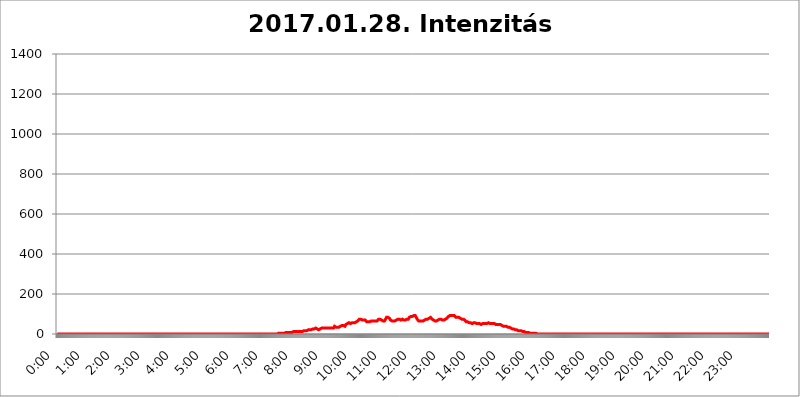
| Category | 2017.01.28. Intenzitás [W/m^2] |
|---|---|
| 0.0 | 0 |
| 0.0006944444444444445 | 0 |
| 0.001388888888888889 | 0 |
| 0.0020833333333333333 | 0 |
| 0.002777777777777778 | 0 |
| 0.003472222222222222 | 0 |
| 0.004166666666666667 | 0 |
| 0.004861111111111111 | 0 |
| 0.005555555555555556 | 0 |
| 0.0062499999999999995 | 0 |
| 0.006944444444444444 | 0 |
| 0.007638888888888889 | 0 |
| 0.008333333333333333 | 0 |
| 0.009027777777777779 | 0 |
| 0.009722222222222222 | 0 |
| 0.010416666666666666 | 0 |
| 0.011111111111111112 | 0 |
| 0.011805555555555555 | 0 |
| 0.012499999999999999 | 0 |
| 0.013194444444444444 | 0 |
| 0.013888888888888888 | 0 |
| 0.014583333333333332 | 0 |
| 0.015277777777777777 | 0 |
| 0.015972222222222224 | 0 |
| 0.016666666666666666 | 0 |
| 0.017361111111111112 | 0 |
| 0.018055555555555557 | 0 |
| 0.01875 | 0 |
| 0.019444444444444445 | 0 |
| 0.02013888888888889 | 0 |
| 0.020833333333333332 | 0 |
| 0.02152777777777778 | 0 |
| 0.022222222222222223 | 0 |
| 0.02291666666666667 | 0 |
| 0.02361111111111111 | 0 |
| 0.024305555555555556 | 0 |
| 0.024999999999999998 | 0 |
| 0.025694444444444447 | 0 |
| 0.02638888888888889 | 0 |
| 0.027083333333333334 | 0 |
| 0.027777777777777776 | 0 |
| 0.02847222222222222 | 0 |
| 0.029166666666666664 | 0 |
| 0.029861111111111113 | 0 |
| 0.030555555555555555 | 0 |
| 0.03125 | 0 |
| 0.03194444444444445 | 0 |
| 0.03263888888888889 | 0 |
| 0.03333333333333333 | 0 |
| 0.034027777777777775 | 0 |
| 0.034722222222222224 | 0 |
| 0.035416666666666666 | 0 |
| 0.036111111111111115 | 0 |
| 0.03680555555555556 | 0 |
| 0.0375 | 0 |
| 0.03819444444444444 | 0 |
| 0.03888888888888889 | 0 |
| 0.03958333333333333 | 0 |
| 0.04027777777777778 | 0 |
| 0.04097222222222222 | 0 |
| 0.041666666666666664 | 0 |
| 0.042361111111111106 | 0 |
| 0.04305555555555556 | 0 |
| 0.043750000000000004 | 0 |
| 0.044444444444444446 | 0 |
| 0.04513888888888889 | 0 |
| 0.04583333333333334 | 0 |
| 0.04652777777777778 | 0 |
| 0.04722222222222222 | 0 |
| 0.04791666666666666 | 0 |
| 0.04861111111111111 | 0 |
| 0.049305555555555554 | 0 |
| 0.049999999999999996 | 0 |
| 0.05069444444444445 | 0 |
| 0.051388888888888894 | 0 |
| 0.052083333333333336 | 0 |
| 0.05277777777777778 | 0 |
| 0.05347222222222222 | 0 |
| 0.05416666666666667 | 0 |
| 0.05486111111111111 | 0 |
| 0.05555555555555555 | 0 |
| 0.05625 | 0 |
| 0.05694444444444444 | 0 |
| 0.057638888888888885 | 0 |
| 0.05833333333333333 | 0 |
| 0.05902777777777778 | 0 |
| 0.059722222222222225 | 0 |
| 0.06041666666666667 | 0 |
| 0.061111111111111116 | 0 |
| 0.06180555555555556 | 0 |
| 0.0625 | 0 |
| 0.06319444444444444 | 0 |
| 0.06388888888888888 | 0 |
| 0.06458333333333334 | 0 |
| 0.06527777777777778 | 0 |
| 0.06597222222222222 | 0 |
| 0.06666666666666667 | 0 |
| 0.06736111111111111 | 0 |
| 0.06805555555555555 | 0 |
| 0.06874999999999999 | 0 |
| 0.06944444444444443 | 0 |
| 0.07013888888888889 | 0 |
| 0.07083333333333333 | 0 |
| 0.07152777777777779 | 0 |
| 0.07222222222222223 | 0 |
| 0.07291666666666667 | 0 |
| 0.07361111111111111 | 0 |
| 0.07430555555555556 | 0 |
| 0.075 | 0 |
| 0.07569444444444444 | 0 |
| 0.0763888888888889 | 0 |
| 0.07708333333333334 | 0 |
| 0.07777777777777778 | 0 |
| 0.07847222222222222 | 0 |
| 0.07916666666666666 | 0 |
| 0.0798611111111111 | 0 |
| 0.08055555555555556 | 0 |
| 0.08125 | 0 |
| 0.08194444444444444 | 0 |
| 0.08263888888888889 | 0 |
| 0.08333333333333333 | 0 |
| 0.08402777777777777 | 0 |
| 0.08472222222222221 | 0 |
| 0.08541666666666665 | 0 |
| 0.08611111111111112 | 0 |
| 0.08680555555555557 | 0 |
| 0.08750000000000001 | 0 |
| 0.08819444444444445 | 0 |
| 0.08888888888888889 | 0 |
| 0.08958333333333333 | 0 |
| 0.09027777777777778 | 0 |
| 0.09097222222222222 | 0 |
| 0.09166666666666667 | 0 |
| 0.09236111111111112 | 0 |
| 0.09305555555555556 | 0 |
| 0.09375 | 0 |
| 0.09444444444444444 | 0 |
| 0.09513888888888888 | 0 |
| 0.09583333333333333 | 0 |
| 0.09652777777777777 | 0 |
| 0.09722222222222222 | 0 |
| 0.09791666666666667 | 0 |
| 0.09861111111111111 | 0 |
| 0.09930555555555555 | 0 |
| 0.09999999999999999 | 0 |
| 0.10069444444444443 | 0 |
| 0.1013888888888889 | 0 |
| 0.10208333333333335 | 0 |
| 0.10277777777777779 | 0 |
| 0.10347222222222223 | 0 |
| 0.10416666666666667 | 0 |
| 0.10486111111111111 | 0 |
| 0.10555555555555556 | 0 |
| 0.10625 | 0 |
| 0.10694444444444444 | 0 |
| 0.1076388888888889 | 0 |
| 0.10833333333333334 | 0 |
| 0.10902777777777778 | 0 |
| 0.10972222222222222 | 0 |
| 0.1111111111111111 | 0 |
| 0.11180555555555556 | 0 |
| 0.11180555555555556 | 0 |
| 0.1125 | 0 |
| 0.11319444444444444 | 0 |
| 0.11388888888888889 | 0 |
| 0.11458333333333333 | 0 |
| 0.11527777777777777 | 0 |
| 0.11597222222222221 | 0 |
| 0.11666666666666665 | 0 |
| 0.1173611111111111 | 0 |
| 0.11805555555555557 | 0 |
| 0.11944444444444445 | 0 |
| 0.12013888888888889 | 0 |
| 0.12083333333333333 | 0 |
| 0.12152777777777778 | 0 |
| 0.12222222222222223 | 0 |
| 0.12291666666666667 | 0 |
| 0.12291666666666667 | 0 |
| 0.12361111111111112 | 0 |
| 0.12430555555555556 | 0 |
| 0.125 | 0 |
| 0.12569444444444444 | 0 |
| 0.12638888888888888 | 0 |
| 0.12708333333333333 | 0 |
| 0.16875 | 0 |
| 0.12847222222222224 | 0 |
| 0.12916666666666668 | 0 |
| 0.12986111111111112 | 0 |
| 0.13055555555555556 | 0 |
| 0.13125 | 0 |
| 0.13194444444444445 | 0 |
| 0.1326388888888889 | 0 |
| 0.13333333333333333 | 0 |
| 0.13402777777777777 | 0 |
| 0.13402777777777777 | 0 |
| 0.13472222222222222 | 0 |
| 0.13541666666666666 | 0 |
| 0.1361111111111111 | 0 |
| 0.13749999999999998 | 0 |
| 0.13819444444444443 | 0 |
| 0.1388888888888889 | 0 |
| 0.13958333333333334 | 0 |
| 0.14027777777777778 | 0 |
| 0.14097222222222222 | 0 |
| 0.14166666666666666 | 0 |
| 0.1423611111111111 | 0 |
| 0.14305555555555557 | 0 |
| 0.14375000000000002 | 0 |
| 0.14444444444444446 | 0 |
| 0.1451388888888889 | 0 |
| 0.1451388888888889 | 0 |
| 0.14652777777777778 | 0 |
| 0.14722222222222223 | 0 |
| 0.14791666666666667 | 0 |
| 0.1486111111111111 | 0 |
| 0.14930555555555555 | 0 |
| 0.15 | 0 |
| 0.15069444444444444 | 0 |
| 0.15138888888888888 | 0 |
| 0.15208333333333332 | 0 |
| 0.15277777777777776 | 0 |
| 0.15347222222222223 | 0 |
| 0.15416666666666667 | 0 |
| 0.15486111111111112 | 0 |
| 0.15555555555555556 | 0 |
| 0.15625 | 0 |
| 0.15694444444444444 | 0 |
| 0.15763888888888888 | 0 |
| 0.15833333333333333 | 0 |
| 0.15902777777777777 | 0 |
| 0.15972222222222224 | 0 |
| 0.16041666666666668 | 0 |
| 0.16111111111111112 | 0 |
| 0.16180555555555556 | 0 |
| 0.1625 | 0 |
| 0.16319444444444445 | 0 |
| 0.1638888888888889 | 0 |
| 0.16458333333333333 | 0 |
| 0.16527777777777777 | 0 |
| 0.16597222222222222 | 0 |
| 0.16666666666666666 | 0 |
| 0.1673611111111111 | 0 |
| 0.16805555555555554 | 0 |
| 0.16874999999999998 | 0 |
| 0.16944444444444443 | 0 |
| 0.17013888888888887 | 0 |
| 0.1708333333333333 | 0 |
| 0.17152777777777775 | 0 |
| 0.17222222222222225 | 0 |
| 0.1729166666666667 | 0 |
| 0.17361111111111113 | 0 |
| 0.17430555555555557 | 0 |
| 0.17500000000000002 | 0 |
| 0.17569444444444446 | 0 |
| 0.1763888888888889 | 0 |
| 0.17708333333333334 | 0 |
| 0.17777777777777778 | 0 |
| 0.17847222222222223 | 0 |
| 0.17916666666666667 | 0 |
| 0.1798611111111111 | 0 |
| 0.18055555555555555 | 0 |
| 0.18125 | 0 |
| 0.18194444444444444 | 0 |
| 0.1826388888888889 | 0 |
| 0.18333333333333335 | 0 |
| 0.1840277777777778 | 0 |
| 0.18472222222222223 | 0 |
| 0.18541666666666667 | 0 |
| 0.18611111111111112 | 0 |
| 0.18680555555555556 | 0 |
| 0.1875 | 0 |
| 0.18819444444444444 | 0 |
| 0.18888888888888888 | 0 |
| 0.18958333333333333 | 0 |
| 0.19027777777777777 | 0 |
| 0.1909722222222222 | 0 |
| 0.19166666666666665 | 0 |
| 0.19236111111111112 | 0 |
| 0.19305555555555554 | 0 |
| 0.19375 | 0 |
| 0.19444444444444445 | 0 |
| 0.1951388888888889 | 0 |
| 0.19583333333333333 | 0 |
| 0.19652777777777777 | 0 |
| 0.19722222222222222 | 0 |
| 0.19791666666666666 | 0 |
| 0.1986111111111111 | 0 |
| 0.19930555555555554 | 0 |
| 0.19999999999999998 | 0 |
| 0.20069444444444443 | 0 |
| 0.20138888888888887 | 0 |
| 0.2020833333333333 | 0 |
| 0.2027777777777778 | 0 |
| 0.2034722222222222 | 0 |
| 0.2041666666666667 | 0 |
| 0.20486111111111113 | 0 |
| 0.20555555555555557 | 0 |
| 0.20625000000000002 | 0 |
| 0.20694444444444446 | 0 |
| 0.2076388888888889 | 0 |
| 0.20833333333333334 | 0 |
| 0.20902777777777778 | 0 |
| 0.20972222222222223 | 0 |
| 0.21041666666666667 | 0 |
| 0.2111111111111111 | 0 |
| 0.21180555555555555 | 0 |
| 0.2125 | 0 |
| 0.21319444444444444 | 0 |
| 0.2138888888888889 | 0 |
| 0.21458333333333335 | 0 |
| 0.2152777777777778 | 0 |
| 0.21597222222222223 | 0 |
| 0.21666666666666667 | 0 |
| 0.21736111111111112 | 0 |
| 0.21805555555555556 | 0 |
| 0.21875 | 0 |
| 0.21944444444444444 | 0 |
| 0.22013888888888888 | 0 |
| 0.22083333333333333 | 0 |
| 0.22152777777777777 | 0 |
| 0.2222222222222222 | 0 |
| 0.22291666666666665 | 0 |
| 0.2236111111111111 | 0 |
| 0.22430555555555556 | 0 |
| 0.225 | 0 |
| 0.22569444444444445 | 0 |
| 0.2263888888888889 | 0 |
| 0.22708333333333333 | 0 |
| 0.22777777777777777 | 0 |
| 0.22847222222222222 | 0 |
| 0.22916666666666666 | 0 |
| 0.2298611111111111 | 0 |
| 0.23055555555555554 | 0 |
| 0.23124999999999998 | 0 |
| 0.23194444444444443 | 0 |
| 0.23263888888888887 | 0 |
| 0.2333333333333333 | 0 |
| 0.2340277777777778 | 0 |
| 0.2347222222222222 | 0 |
| 0.2354166666666667 | 0 |
| 0.23611111111111113 | 0 |
| 0.23680555555555557 | 0 |
| 0.23750000000000002 | 0 |
| 0.23819444444444446 | 0 |
| 0.2388888888888889 | 0 |
| 0.23958333333333334 | 0 |
| 0.24027777777777778 | 0 |
| 0.24097222222222223 | 0 |
| 0.24166666666666667 | 0 |
| 0.2423611111111111 | 0 |
| 0.24305555555555555 | 0 |
| 0.24375 | 0 |
| 0.24444444444444446 | 0 |
| 0.24513888888888888 | 0 |
| 0.24583333333333335 | 0 |
| 0.2465277777777778 | 0 |
| 0.24722222222222223 | 0 |
| 0.24791666666666667 | 0 |
| 0.24861111111111112 | 0 |
| 0.24930555555555556 | 0 |
| 0.25 | 0 |
| 0.25069444444444444 | 0 |
| 0.2513888888888889 | 0 |
| 0.2520833333333333 | 0 |
| 0.25277777777777777 | 0 |
| 0.2534722222222222 | 0 |
| 0.25416666666666665 | 0 |
| 0.2548611111111111 | 0 |
| 0.2555555555555556 | 0 |
| 0.25625000000000003 | 0 |
| 0.2569444444444445 | 0 |
| 0.2576388888888889 | 0 |
| 0.25833333333333336 | 0 |
| 0.2590277777777778 | 0 |
| 0.25972222222222224 | 0 |
| 0.2604166666666667 | 0 |
| 0.2611111111111111 | 0 |
| 0.26180555555555557 | 0 |
| 0.2625 | 0 |
| 0.26319444444444445 | 0 |
| 0.2638888888888889 | 0 |
| 0.26458333333333334 | 0 |
| 0.2652777777777778 | 0 |
| 0.2659722222222222 | 0 |
| 0.26666666666666666 | 0 |
| 0.2673611111111111 | 0 |
| 0.26805555555555555 | 0 |
| 0.26875 | 0 |
| 0.26944444444444443 | 0 |
| 0.2701388888888889 | 0 |
| 0.2708333333333333 | 0 |
| 0.27152777777777776 | 0 |
| 0.2722222222222222 | 0 |
| 0.27291666666666664 | 0 |
| 0.2736111111111111 | 0 |
| 0.2743055555555555 | 0 |
| 0.27499999999999997 | 0 |
| 0.27569444444444446 | 0 |
| 0.27638888888888885 | 0 |
| 0.27708333333333335 | 0 |
| 0.2777777777777778 | 0 |
| 0.27847222222222223 | 0 |
| 0.2791666666666667 | 0 |
| 0.2798611111111111 | 0 |
| 0.28055555555555556 | 0 |
| 0.28125 | 0 |
| 0.28194444444444444 | 0 |
| 0.2826388888888889 | 0 |
| 0.2833333333333333 | 0 |
| 0.28402777777777777 | 0 |
| 0.2847222222222222 | 0 |
| 0.28541666666666665 | 0 |
| 0.28611111111111115 | 0 |
| 0.28680555555555554 | 0 |
| 0.28750000000000003 | 0 |
| 0.2881944444444445 | 0 |
| 0.2888888888888889 | 0 |
| 0.28958333333333336 | 0 |
| 0.2902777777777778 | 0 |
| 0.29097222222222224 | 0 |
| 0.2916666666666667 | 0 |
| 0.2923611111111111 | 0 |
| 0.29305555555555557 | 0 |
| 0.29375 | 0 |
| 0.29444444444444445 | 0 |
| 0.2951388888888889 | 0 |
| 0.29583333333333334 | 0 |
| 0.2965277777777778 | 0 |
| 0.2972222222222222 | 0 |
| 0.29791666666666666 | 0 |
| 0.2986111111111111 | 0 |
| 0.29930555555555555 | 0 |
| 0.3 | 0 |
| 0.30069444444444443 | 0 |
| 0.3013888888888889 | 0 |
| 0.3020833333333333 | 0 |
| 0.30277777777777776 | 0 |
| 0.3034722222222222 | 0 |
| 0.30416666666666664 | 0 |
| 0.3048611111111111 | 0 |
| 0.3055555555555555 | 0 |
| 0.30624999999999997 | 0 |
| 0.3069444444444444 | 0 |
| 0.3076388888888889 | 0 |
| 0.30833333333333335 | 0 |
| 0.3090277777777778 | 0 |
| 0.30972222222222223 | 3.525 |
| 0.3104166666666667 | 3.525 |
| 0.3111111111111111 | 3.525 |
| 0.31180555555555556 | 3.525 |
| 0.3125 | 3.525 |
| 0.31319444444444444 | 3.525 |
| 0.3138888888888889 | 3.525 |
| 0.3145833333333333 | 3.525 |
| 0.31527777777777777 | 3.525 |
| 0.3159722222222222 | 3.525 |
| 0.31666666666666665 | 3.525 |
| 0.31736111111111115 | 3.525 |
| 0.31805555555555554 | 3.525 |
| 0.31875000000000003 | 3.525 |
| 0.3194444444444445 | 3.525 |
| 0.3201388888888889 | 3.525 |
| 0.32083333333333336 | 7.887 |
| 0.3215277777777778 | 7.887 |
| 0.32222222222222224 | 7.887 |
| 0.3229166666666667 | 7.887 |
| 0.3236111111111111 | 7.887 |
| 0.32430555555555557 | 7.887 |
| 0.325 | 7.887 |
| 0.32569444444444445 | 7.887 |
| 0.3263888888888889 | 7.887 |
| 0.32708333333333334 | 7.887 |
| 0.3277777777777778 | 7.887 |
| 0.3284722222222222 | 7.887 |
| 0.32916666666666666 | 7.887 |
| 0.3298611111111111 | 7.887 |
| 0.33055555555555555 | 7.887 |
| 0.33125 | 12.257 |
| 0.33194444444444443 | 12.257 |
| 0.3326388888888889 | 12.257 |
| 0.3333333333333333 | 12.257 |
| 0.3340277777777778 | 12.257 |
| 0.3347222222222222 | 12.257 |
| 0.3354166666666667 | 12.257 |
| 0.3361111111111111 | 12.257 |
| 0.3368055555555556 | 12.257 |
| 0.33749999999999997 | 12.257 |
| 0.33819444444444446 | 12.257 |
| 0.33888888888888885 | 12.257 |
| 0.33958333333333335 | 12.257 |
| 0.34027777777777773 | 12.257 |
| 0.34097222222222223 | 12.257 |
| 0.3416666666666666 | 12.257 |
| 0.3423611111111111 | 12.257 |
| 0.3430555555555555 | 12.257 |
| 0.34375 | 12.257 |
| 0.3444444444444445 | 12.257 |
| 0.3451388888888889 | 16.636 |
| 0.3458333333333334 | 16.636 |
| 0.34652777777777777 | 16.636 |
| 0.34722222222222227 | 16.636 |
| 0.34791666666666665 | 16.636 |
| 0.34861111111111115 | 16.636 |
| 0.34930555555555554 | 16.636 |
| 0.35000000000000003 | 16.636 |
| 0.3506944444444444 | 16.636 |
| 0.3513888888888889 | 16.636 |
| 0.3520833333333333 | 21.024 |
| 0.3527777777777778 | 21.024 |
| 0.3534722222222222 | 21.024 |
| 0.3541666666666667 | 21.024 |
| 0.3548611111111111 | 21.024 |
| 0.35555555555555557 | 21.024 |
| 0.35625 | 21.024 |
| 0.35694444444444445 | 21.024 |
| 0.3576388888888889 | 21.024 |
| 0.35833333333333334 | 25.419 |
| 0.3590277777777778 | 25.419 |
| 0.3597222222222222 | 25.419 |
| 0.36041666666666666 | 25.419 |
| 0.3611111111111111 | 29.823 |
| 0.36180555555555555 | 25.419 |
| 0.3625 | 29.823 |
| 0.36319444444444443 | 29.823 |
| 0.3638888888888889 | 29.823 |
| 0.3645833333333333 | 25.419 |
| 0.3652777777777778 | 25.419 |
| 0.3659722222222222 | 25.419 |
| 0.3666666666666667 | 21.024 |
| 0.3673611111111111 | 21.024 |
| 0.3680555555555556 | 21.024 |
| 0.36874999999999997 | 25.419 |
| 0.36944444444444446 | 29.823 |
| 0.37013888888888885 | 29.823 |
| 0.37083333333333335 | 29.823 |
| 0.37152777777777773 | 29.823 |
| 0.37222222222222223 | 29.823 |
| 0.3729166666666666 | 29.823 |
| 0.3736111111111111 | 29.823 |
| 0.3743055555555555 | 29.823 |
| 0.375 | 29.823 |
| 0.3756944444444445 | 29.823 |
| 0.3763888888888889 | 29.823 |
| 0.3770833333333334 | 29.823 |
| 0.37777777777777777 | 29.823 |
| 0.37847222222222227 | 25.419 |
| 0.37916666666666665 | 29.823 |
| 0.37986111111111115 | 29.823 |
| 0.38055555555555554 | 29.823 |
| 0.38125000000000003 | 29.823 |
| 0.3819444444444444 | 29.823 |
| 0.3826388888888889 | 29.823 |
| 0.3833333333333333 | 29.823 |
| 0.3840277777777778 | 29.823 |
| 0.3847222222222222 | 25.419 |
| 0.3854166666666667 | 29.823 |
| 0.3861111111111111 | 29.823 |
| 0.38680555555555557 | 29.823 |
| 0.3875 | 29.823 |
| 0.38819444444444445 | 34.234 |
| 0.3888888888888889 | 38.653 |
| 0.38958333333333334 | 38.653 |
| 0.3902777777777778 | 34.234 |
| 0.3909722222222222 | 34.234 |
| 0.39166666666666666 | 34.234 |
| 0.3923611111111111 | 29.823 |
| 0.39305555555555555 | 34.234 |
| 0.39375 | 34.234 |
| 0.39444444444444443 | 34.234 |
| 0.3951388888888889 | 34.234 |
| 0.3958333333333333 | 34.234 |
| 0.3965277777777778 | 38.653 |
| 0.3972222222222222 | 38.653 |
| 0.3979166666666667 | 43.079 |
| 0.3986111111111111 | 43.079 |
| 0.3993055555555556 | 43.079 |
| 0.39999999999999997 | 47.511 |
| 0.40069444444444446 | 43.079 |
| 0.40138888888888885 | 43.079 |
| 0.40208333333333335 | 43.079 |
| 0.40277777777777773 | 38.653 |
| 0.40347222222222223 | 38.653 |
| 0.4041666666666666 | 43.079 |
| 0.4048611111111111 | 47.511 |
| 0.4055555555555555 | 47.511 |
| 0.40625 | 51.951 |
| 0.4069444444444445 | 51.951 |
| 0.4076388888888889 | 51.951 |
| 0.4083333333333334 | 51.951 |
| 0.40902777777777777 | 56.398 |
| 0.40972222222222227 | 56.398 |
| 0.41041666666666665 | 56.398 |
| 0.41111111111111115 | 51.951 |
| 0.41180555555555554 | 51.951 |
| 0.41250000000000003 | 56.398 |
| 0.4131944444444444 | 56.398 |
| 0.4138888888888889 | 56.398 |
| 0.4145833333333333 | 56.398 |
| 0.4152777777777778 | 56.398 |
| 0.4159722222222222 | 56.398 |
| 0.4166666666666667 | 56.398 |
| 0.4173611111111111 | 56.398 |
| 0.41805555555555557 | 56.398 |
| 0.41875 | 60.85 |
| 0.41944444444444445 | 60.85 |
| 0.4201388888888889 | 60.85 |
| 0.42083333333333334 | 60.85 |
| 0.4215277777777778 | 65.31 |
| 0.4222222222222222 | 69.775 |
| 0.42291666666666666 | 69.775 |
| 0.4236111111111111 | 74.246 |
| 0.42430555555555555 | 74.246 |
| 0.425 | 74.246 |
| 0.42569444444444443 | 74.246 |
| 0.4263888888888889 | 74.246 |
| 0.4270833333333333 | 69.775 |
| 0.4277777777777778 | 69.775 |
| 0.4284722222222222 | 69.775 |
| 0.4291666666666667 | 69.775 |
| 0.4298611111111111 | 69.775 |
| 0.4305555555555556 | 69.775 |
| 0.43124999999999997 | 69.775 |
| 0.43194444444444446 | 69.775 |
| 0.43263888888888885 | 65.31 |
| 0.43333333333333335 | 65.31 |
| 0.43402777777777773 | 60.85 |
| 0.43472222222222223 | 60.85 |
| 0.4354166666666666 | 60.85 |
| 0.4361111111111111 | 60.85 |
| 0.4368055555555555 | 65.31 |
| 0.4375 | 65.31 |
| 0.4381944444444445 | 60.85 |
| 0.4388888888888889 | 60.85 |
| 0.4395833333333334 | 65.31 |
| 0.44027777777777777 | 65.31 |
| 0.44097222222222227 | 65.31 |
| 0.44166666666666665 | 65.31 |
| 0.44236111111111115 | 65.31 |
| 0.44305555555555554 | 65.31 |
| 0.44375000000000003 | 65.31 |
| 0.4444444444444444 | 65.31 |
| 0.4451388888888889 | 65.31 |
| 0.4458333333333333 | 65.31 |
| 0.4465277777777778 | 65.31 |
| 0.4472222222222222 | 65.31 |
| 0.4479166666666667 | 65.31 |
| 0.4486111111111111 | 65.31 |
| 0.44930555555555557 | 65.31 |
| 0.45 | 69.775 |
| 0.45069444444444445 | 74.246 |
| 0.4513888888888889 | 74.246 |
| 0.45208333333333334 | 74.246 |
| 0.4527777777777778 | 74.246 |
| 0.4534722222222222 | 74.246 |
| 0.45416666666666666 | 69.775 |
| 0.4548611111111111 | 69.775 |
| 0.45555555555555555 | 65.31 |
| 0.45625 | 65.31 |
| 0.45694444444444443 | 65.31 |
| 0.4576388888888889 | 65.31 |
| 0.4583333333333333 | 65.31 |
| 0.4590277777777778 | 65.31 |
| 0.4597222222222222 | 69.775 |
| 0.4604166666666667 | 74.246 |
| 0.4611111111111111 | 78.722 |
| 0.4618055555555556 | 83.205 |
| 0.46249999999999997 | 83.205 |
| 0.46319444444444446 | 83.205 |
| 0.46388888888888885 | 83.205 |
| 0.46458333333333335 | 83.205 |
| 0.46527777777777773 | 78.722 |
| 0.46597222222222223 | 78.722 |
| 0.4666666666666666 | 74.246 |
| 0.4673611111111111 | 69.775 |
| 0.4680555555555555 | 65.31 |
| 0.46875 | 65.31 |
| 0.4694444444444445 | 65.31 |
| 0.4701388888888889 | 65.31 |
| 0.4708333333333334 | 65.31 |
| 0.47152777777777777 | 65.31 |
| 0.47222222222222227 | 69.775 |
| 0.47291666666666665 | 65.31 |
| 0.47361111111111115 | 65.31 |
| 0.47430555555555554 | 69.775 |
| 0.47500000000000003 | 69.775 |
| 0.4756944444444444 | 69.775 |
| 0.4763888888888889 | 74.246 |
| 0.4770833333333333 | 74.246 |
| 0.4777777777777778 | 74.246 |
| 0.4784722222222222 | 74.246 |
| 0.4791666666666667 | 74.246 |
| 0.4798611111111111 | 74.246 |
| 0.48055555555555557 | 74.246 |
| 0.48125 | 69.775 |
| 0.48194444444444445 | 69.775 |
| 0.4826388888888889 | 69.775 |
| 0.48333333333333334 | 74.246 |
| 0.4840277777777778 | 74.246 |
| 0.4847222222222222 | 74.246 |
| 0.48541666666666666 | 74.246 |
| 0.4861111111111111 | 69.775 |
| 0.48680555555555555 | 69.775 |
| 0.4875 | 69.775 |
| 0.48819444444444443 | 69.775 |
| 0.4888888888888889 | 74.246 |
| 0.4895833333333333 | 74.246 |
| 0.4902777777777778 | 74.246 |
| 0.4909722222222222 | 74.246 |
| 0.4916666666666667 | 74.246 |
| 0.4923611111111111 | 74.246 |
| 0.4930555555555556 | 78.722 |
| 0.49374999999999997 | 83.205 |
| 0.49444444444444446 | 83.205 |
| 0.49513888888888885 | 83.205 |
| 0.49583333333333335 | 87.692 |
| 0.49652777777777773 | 87.692 |
| 0.49722222222222223 | 87.692 |
| 0.4979166666666666 | 87.692 |
| 0.4986111111111111 | 92.184 |
| 0.4993055555555555 | 92.184 |
| 0.5 | 92.184 |
| 0.5006944444444444 | 92.184 |
| 0.5013888888888889 | 92.184 |
| 0.5020833333333333 | 92.184 |
| 0.5027777777777778 | 87.692 |
| 0.5034722222222222 | 83.205 |
| 0.5041666666666667 | 78.722 |
| 0.5048611111111111 | 74.246 |
| 0.5055555555555555 | 69.775 |
| 0.50625 | 69.775 |
| 0.5069444444444444 | 65.31 |
| 0.5076388888888889 | 65.31 |
| 0.5083333333333333 | 65.31 |
| 0.5090277777777777 | 65.31 |
| 0.5097222222222222 | 65.31 |
| 0.5104166666666666 | 65.31 |
| 0.5111111111111112 | 65.31 |
| 0.5118055555555555 | 65.31 |
| 0.5125000000000001 | 65.31 |
| 0.5131944444444444 | 65.31 |
| 0.513888888888889 | 69.775 |
| 0.5145833333333333 | 69.775 |
| 0.5152777777777778 | 69.775 |
| 0.5159722222222222 | 74.246 |
| 0.5166666666666667 | 74.246 |
| 0.517361111111111 | 74.246 |
| 0.5180555555555556 | 78.722 |
| 0.5187499999999999 | 74.246 |
| 0.5194444444444445 | 74.246 |
| 0.5201388888888888 | 78.722 |
| 0.5208333333333334 | 78.722 |
| 0.5215277777777778 | 78.722 |
| 0.5222222222222223 | 83.205 |
| 0.5229166666666667 | 83.205 |
| 0.5236111111111111 | 83.205 |
| 0.5243055555555556 | 78.722 |
| 0.525 | 78.722 |
| 0.5256944444444445 | 74.246 |
| 0.5263888888888889 | 74.246 |
| 0.5270833333333333 | 69.775 |
| 0.5277777777777778 | 69.775 |
| 0.5284722222222222 | 65.31 |
| 0.5291666666666667 | 65.31 |
| 0.5298611111111111 | 65.31 |
| 0.5305555555555556 | 65.31 |
| 0.53125 | 65.31 |
| 0.5319444444444444 | 65.31 |
| 0.5326388888888889 | 65.31 |
| 0.5333333333333333 | 69.775 |
| 0.5340277777777778 | 69.775 |
| 0.5347222222222222 | 69.775 |
| 0.5354166666666667 | 69.775 |
| 0.5361111111111111 | 74.246 |
| 0.5368055555555555 | 74.246 |
| 0.5375 | 74.246 |
| 0.5381944444444444 | 74.246 |
| 0.5388888888888889 | 74.246 |
| 0.5395833333333333 | 74.246 |
| 0.5402777777777777 | 69.775 |
| 0.5409722222222222 | 69.775 |
| 0.5416666666666666 | 69.775 |
| 0.5423611111111112 | 69.775 |
| 0.5430555555555555 | 69.775 |
| 0.5437500000000001 | 69.775 |
| 0.5444444444444444 | 74.246 |
| 0.545138888888889 | 74.246 |
| 0.5458333333333333 | 78.722 |
| 0.5465277777777778 | 78.722 |
| 0.5472222222222222 | 83.205 |
| 0.5479166666666667 | 83.205 |
| 0.548611111111111 | 87.692 |
| 0.5493055555555556 | 87.692 |
| 0.5499999999999999 | 92.184 |
| 0.5506944444444445 | 92.184 |
| 0.5513888888888888 | 92.184 |
| 0.5520833333333334 | 92.184 |
| 0.5527777777777778 | 92.184 |
| 0.5534722222222223 | 92.184 |
| 0.5541666666666667 | 92.184 |
| 0.5548611111111111 | 92.184 |
| 0.5555555555555556 | 92.184 |
| 0.55625 | 92.184 |
| 0.5569444444444445 | 92.184 |
| 0.5576388888888889 | 87.692 |
| 0.5583333333333333 | 87.692 |
| 0.5590277777777778 | 83.205 |
| 0.5597222222222222 | 83.205 |
| 0.5604166666666667 | 83.205 |
| 0.5611111111111111 | 83.205 |
| 0.5618055555555556 | 83.205 |
| 0.5625 | 83.205 |
| 0.5631944444444444 | 83.205 |
| 0.5638888888888889 | 78.722 |
| 0.5645833333333333 | 78.722 |
| 0.5652777777777778 | 78.722 |
| 0.5659722222222222 | 74.246 |
| 0.5666666666666667 | 74.246 |
| 0.5673611111111111 | 74.246 |
| 0.5680555555555555 | 74.246 |
| 0.56875 | 74.246 |
| 0.5694444444444444 | 74.246 |
| 0.5701388888888889 | 74.246 |
| 0.5708333333333333 | 69.775 |
| 0.5715277777777777 | 69.775 |
| 0.5722222222222222 | 65.31 |
| 0.5729166666666666 | 65.31 |
| 0.5736111111111112 | 60.85 |
| 0.5743055555555555 | 60.85 |
| 0.5750000000000001 | 60.85 |
| 0.5756944444444444 | 60.85 |
| 0.576388888888889 | 56.398 |
| 0.5770833333333333 | 56.398 |
| 0.5777777777777778 | 56.398 |
| 0.5784722222222222 | 56.398 |
| 0.5791666666666667 | 56.398 |
| 0.579861111111111 | 56.398 |
| 0.5805555555555556 | 56.398 |
| 0.5812499999999999 | 56.398 |
| 0.5819444444444445 | 51.951 |
| 0.5826388888888888 | 56.398 |
| 0.5833333333333334 | 56.398 |
| 0.5840277777777778 | 56.398 |
| 0.5847222222222223 | 56.398 |
| 0.5854166666666667 | 56.398 |
| 0.5861111111111111 | 56.398 |
| 0.5868055555555556 | 51.951 |
| 0.5875 | 51.951 |
| 0.5881944444444445 | 51.951 |
| 0.5888888888888889 | 51.951 |
| 0.5895833333333333 | 51.951 |
| 0.5902777777777778 | 51.951 |
| 0.5909722222222222 | 51.951 |
| 0.5916666666666667 | 51.951 |
| 0.5923611111111111 | 51.951 |
| 0.5930555555555556 | 51.951 |
| 0.59375 | 47.511 |
| 0.5944444444444444 | 47.511 |
| 0.5951388888888889 | 47.511 |
| 0.5958333333333333 | 47.511 |
| 0.5965277777777778 | 51.951 |
| 0.5972222222222222 | 51.951 |
| 0.5979166666666667 | 51.951 |
| 0.5986111111111111 | 51.951 |
| 0.5993055555555555 | 51.951 |
| 0.6 | 51.951 |
| 0.6006944444444444 | 51.951 |
| 0.6013888888888889 | 51.951 |
| 0.6020833333333333 | 51.951 |
| 0.6027777777777777 | 51.951 |
| 0.6034722222222222 | 51.951 |
| 0.6041666666666666 | 51.951 |
| 0.6048611111111112 | 56.398 |
| 0.6055555555555555 | 51.951 |
| 0.6062500000000001 | 56.398 |
| 0.6069444444444444 | 51.951 |
| 0.607638888888889 | 51.951 |
| 0.6083333333333333 | 51.951 |
| 0.6090277777777778 | 51.951 |
| 0.6097222222222222 | 51.951 |
| 0.6104166666666667 | 51.951 |
| 0.611111111111111 | 51.951 |
| 0.6118055555555556 | 51.951 |
| 0.6124999999999999 | 51.951 |
| 0.6131944444444445 | 51.951 |
| 0.6138888888888888 | 51.951 |
| 0.6145833333333334 | 47.511 |
| 0.6152777777777778 | 47.511 |
| 0.6159722222222223 | 47.511 |
| 0.6166666666666667 | 47.511 |
| 0.6173611111111111 | 47.511 |
| 0.6180555555555556 | 47.511 |
| 0.61875 | 47.511 |
| 0.6194444444444445 | 47.511 |
| 0.6201388888888889 | 47.511 |
| 0.6208333333333333 | 47.511 |
| 0.6215277777777778 | 47.511 |
| 0.6222222222222222 | 43.079 |
| 0.6229166666666667 | 43.079 |
| 0.6236111111111111 | 43.079 |
| 0.6243055555555556 | 38.653 |
| 0.625 | 38.653 |
| 0.6256944444444444 | 38.653 |
| 0.6263888888888889 | 38.653 |
| 0.6270833333333333 | 38.653 |
| 0.6277777777777778 | 38.653 |
| 0.6284722222222222 | 38.653 |
| 0.6291666666666667 | 38.653 |
| 0.6298611111111111 | 38.653 |
| 0.6305555555555555 | 38.653 |
| 0.63125 | 34.234 |
| 0.6319444444444444 | 34.234 |
| 0.6326388888888889 | 34.234 |
| 0.6333333333333333 | 34.234 |
| 0.6340277777777777 | 34.234 |
| 0.6347222222222222 | 29.823 |
| 0.6354166666666666 | 29.823 |
| 0.6361111111111112 | 29.823 |
| 0.6368055555555555 | 29.823 |
| 0.6375000000000001 | 29.823 |
| 0.6381944444444444 | 25.419 |
| 0.638888888888889 | 25.419 |
| 0.6395833333333333 | 25.419 |
| 0.6402777777777778 | 25.419 |
| 0.6409722222222222 | 25.419 |
| 0.6416666666666667 | 25.419 |
| 0.642361111111111 | 21.024 |
| 0.6430555555555556 | 21.024 |
| 0.6437499999999999 | 21.024 |
| 0.6444444444444445 | 21.024 |
| 0.6451388888888888 | 21.024 |
| 0.6458333333333334 | 21.024 |
| 0.6465277777777778 | 16.636 |
| 0.6472222222222223 | 16.636 |
| 0.6479166666666667 | 16.636 |
| 0.6486111111111111 | 16.636 |
| 0.6493055555555556 | 16.636 |
| 0.65 | 16.636 |
| 0.6506944444444445 | 16.636 |
| 0.6513888888888889 | 12.257 |
| 0.6520833333333333 | 12.257 |
| 0.6527777777777778 | 12.257 |
| 0.6534722222222222 | 12.257 |
| 0.6541666666666667 | 12.257 |
| 0.6548611111111111 | 12.257 |
| 0.6555555555555556 | 7.887 |
| 0.65625 | 12.257 |
| 0.6569444444444444 | 7.887 |
| 0.6576388888888889 | 7.887 |
| 0.6583333333333333 | 7.887 |
| 0.6590277777777778 | 7.887 |
| 0.6597222222222222 | 7.887 |
| 0.6604166666666667 | 7.887 |
| 0.6611111111111111 | 7.887 |
| 0.6618055555555555 | 7.887 |
| 0.6625 | 7.887 |
| 0.6631944444444444 | 3.525 |
| 0.6638888888888889 | 3.525 |
| 0.6645833333333333 | 3.525 |
| 0.6652777777777777 | 3.525 |
| 0.6659722222222222 | 3.525 |
| 0.6666666666666666 | 3.525 |
| 0.6673611111111111 | 3.525 |
| 0.6680555555555556 | 3.525 |
| 0.6687500000000001 | 3.525 |
| 0.6694444444444444 | 3.525 |
| 0.6701388888888888 | 3.525 |
| 0.6708333333333334 | 3.525 |
| 0.6715277777777778 | 3.525 |
| 0.6722222222222222 | 0 |
| 0.6729166666666666 | 0 |
| 0.6736111111111112 | 0 |
| 0.6743055555555556 | 0 |
| 0.6749999999999999 | 0 |
| 0.6756944444444444 | 0 |
| 0.6763888888888889 | 0 |
| 0.6770833333333334 | 0 |
| 0.6777777777777777 | 0 |
| 0.6784722222222223 | 0 |
| 0.6791666666666667 | 0 |
| 0.6798611111111111 | 0 |
| 0.6805555555555555 | 0 |
| 0.68125 | 0 |
| 0.6819444444444445 | 0 |
| 0.6826388888888889 | 0 |
| 0.6833333333333332 | 0 |
| 0.6840277777777778 | 0 |
| 0.6847222222222222 | 0 |
| 0.6854166666666667 | 0 |
| 0.686111111111111 | 0 |
| 0.6868055555555556 | 0 |
| 0.6875 | 0 |
| 0.6881944444444444 | 0 |
| 0.688888888888889 | 0 |
| 0.6895833333333333 | 0 |
| 0.6902777777777778 | 0 |
| 0.6909722222222222 | 0 |
| 0.6916666666666668 | 0 |
| 0.6923611111111111 | 0 |
| 0.6930555555555555 | 0 |
| 0.69375 | 0 |
| 0.6944444444444445 | 0 |
| 0.6951388888888889 | 0 |
| 0.6958333333333333 | 0 |
| 0.6965277777777777 | 0 |
| 0.6972222222222223 | 0 |
| 0.6979166666666666 | 0 |
| 0.6986111111111111 | 0 |
| 0.6993055555555556 | 0 |
| 0.7000000000000001 | 0 |
| 0.7006944444444444 | 0 |
| 0.7013888888888888 | 0 |
| 0.7020833333333334 | 0 |
| 0.7027777777777778 | 0 |
| 0.7034722222222222 | 0 |
| 0.7041666666666666 | 0 |
| 0.7048611111111112 | 0 |
| 0.7055555555555556 | 0 |
| 0.7062499999999999 | 0 |
| 0.7069444444444444 | 0 |
| 0.7076388888888889 | 0 |
| 0.7083333333333334 | 0 |
| 0.7090277777777777 | 0 |
| 0.7097222222222223 | 0 |
| 0.7104166666666667 | 0 |
| 0.7111111111111111 | 0 |
| 0.7118055555555555 | 0 |
| 0.7125 | 0 |
| 0.7131944444444445 | 0 |
| 0.7138888888888889 | 0 |
| 0.7145833333333332 | 0 |
| 0.7152777777777778 | 0 |
| 0.7159722222222222 | 0 |
| 0.7166666666666667 | 0 |
| 0.717361111111111 | 0 |
| 0.7180555555555556 | 0 |
| 0.71875 | 0 |
| 0.7194444444444444 | 0 |
| 0.720138888888889 | 0 |
| 0.7208333333333333 | 0 |
| 0.7215277777777778 | 0 |
| 0.7222222222222222 | 0 |
| 0.7229166666666668 | 0 |
| 0.7236111111111111 | 0 |
| 0.7243055555555555 | 0 |
| 0.725 | 0 |
| 0.7256944444444445 | 0 |
| 0.7263888888888889 | 0 |
| 0.7270833333333333 | 0 |
| 0.7277777777777777 | 0 |
| 0.7284722222222223 | 0 |
| 0.7291666666666666 | 0 |
| 0.7298611111111111 | 0 |
| 0.7305555555555556 | 0 |
| 0.7312500000000001 | 0 |
| 0.7319444444444444 | 0 |
| 0.7326388888888888 | 0 |
| 0.7333333333333334 | 0 |
| 0.7340277777777778 | 0 |
| 0.7347222222222222 | 0 |
| 0.7354166666666666 | 0 |
| 0.7361111111111112 | 0 |
| 0.7368055555555556 | 0 |
| 0.7374999999999999 | 0 |
| 0.7381944444444444 | 0 |
| 0.7388888888888889 | 0 |
| 0.7395833333333334 | 0 |
| 0.7402777777777777 | 0 |
| 0.7409722222222223 | 0 |
| 0.7416666666666667 | 0 |
| 0.7423611111111111 | 0 |
| 0.7430555555555555 | 0 |
| 0.74375 | 0 |
| 0.7444444444444445 | 0 |
| 0.7451388888888889 | 0 |
| 0.7458333333333332 | 0 |
| 0.7465277777777778 | 0 |
| 0.7472222222222222 | 0 |
| 0.7479166666666667 | 0 |
| 0.748611111111111 | 0 |
| 0.7493055555555556 | 0 |
| 0.75 | 0 |
| 0.7506944444444444 | 0 |
| 0.751388888888889 | 0 |
| 0.7520833333333333 | 0 |
| 0.7527777777777778 | 0 |
| 0.7534722222222222 | 0 |
| 0.7541666666666668 | 0 |
| 0.7548611111111111 | 0 |
| 0.7555555555555555 | 0 |
| 0.75625 | 0 |
| 0.7569444444444445 | 0 |
| 0.7576388888888889 | 0 |
| 0.7583333333333333 | 0 |
| 0.7590277777777777 | 0 |
| 0.7597222222222223 | 0 |
| 0.7604166666666666 | 0 |
| 0.7611111111111111 | 0 |
| 0.7618055555555556 | 0 |
| 0.7625000000000001 | 0 |
| 0.7631944444444444 | 0 |
| 0.7638888888888888 | 0 |
| 0.7645833333333334 | 0 |
| 0.7652777777777778 | 0 |
| 0.7659722222222222 | 0 |
| 0.7666666666666666 | 0 |
| 0.7673611111111112 | 0 |
| 0.7680555555555556 | 0 |
| 0.7687499999999999 | 0 |
| 0.7694444444444444 | 0 |
| 0.7701388888888889 | 0 |
| 0.7708333333333334 | 0 |
| 0.7715277777777777 | 0 |
| 0.7722222222222223 | 0 |
| 0.7729166666666667 | 0 |
| 0.7736111111111111 | 0 |
| 0.7743055555555555 | 0 |
| 0.775 | 0 |
| 0.7756944444444445 | 0 |
| 0.7763888888888889 | 0 |
| 0.7770833333333332 | 0 |
| 0.7777777777777778 | 0 |
| 0.7784722222222222 | 0 |
| 0.7791666666666667 | 0 |
| 0.779861111111111 | 0 |
| 0.7805555555555556 | 0 |
| 0.78125 | 0 |
| 0.7819444444444444 | 0 |
| 0.782638888888889 | 0 |
| 0.7833333333333333 | 0 |
| 0.7840277777777778 | 0 |
| 0.7847222222222222 | 0 |
| 0.7854166666666668 | 0 |
| 0.7861111111111111 | 0 |
| 0.7868055555555555 | 0 |
| 0.7875 | 0 |
| 0.7881944444444445 | 0 |
| 0.7888888888888889 | 0 |
| 0.7895833333333333 | 0 |
| 0.7902777777777777 | 0 |
| 0.7909722222222223 | 0 |
| 0.7916666666666666 | 0 |
| 0.7923611111111111 | 0 |
| 0.7930555555555556 | 0 |
| 0.7937500000000001 | 0 |
| 0.7944444444444444 | 0 |
| 0.7951388888888888 | 0 |
| 0.7958333333333334 | 0 |
| 0.7965277777777778 | 0 |
| 0.7972222222222222 | 0 |
| 0.7979166666666666 | 0 |
| 0.7986111111111112 | 0 |
| 0.7993055555555556 | 0 |
| 0.7999999999999999 | 0 |
| 0.8006944444444444 | 0 |
| 0.8013888888888889 | 0 |
| 0.8020833333333334 | 0 |
| 0.8027777777777777 | 0 |
| 0.8034722222222223 | 0 |
| 0.8041666666666667 | 0 |
| 0.8048611111111111 | 0 |
| 0.8055555555555555 | 0 |
| 0.80625 | 0 |
| 0.8069444444444445 | 0 |
| 0.8076388888888889 | 0 |
| 0.8083333333333332 | 0 |
| 0.8090277777777778 | 0 |
| 0.8097222222222222 | 0 |
| 0.8104166666666667 | 0 |
| 0.811111111111111 | 0 |
| 0.8118055555555556 | 0 |
| 0.8125 | 0 |
| 0.8131944444444444 | 0 |
| 0.813888888888889 | 0 |
| 0.8145833333333333 | 0 |
| 0.8152777777777778 | 0 |
| 0.8159722222222222 | 0 |
| 0.8166666666666668 | 0 |
| 0.8173611111111111 | 0 |
| 0.8180555555555555 | 0 |
| 0.81875 | 0 |
| 0.8194444444444445 | 0 |
| 0.8201388888888889 | 0 |
| 0.8208333333333333 | 0 |
| 0.8215277777777777 | 0 |
| 0.8222222222222223 | 0 |
| 0.8229166666666666 | 0 |
| 0.8236111111111111 | 0 |
| 0.8243055555555556 | 0 |
| 0.8250000000000001 | 0 |
| 0.8256944444444444 | 0 |
| 0.8263888888888888 | 0 |
| 0.8270833333333334 | 0 |
| 0.8277777777777778 | 0 |
| 0.8284722222222222 | 0 |
| 0.8291666666666666 | 0 |
| 0.8298611111111112 | 0 |
| 0.8305555555555556 | 0 |
| 0.8312499999999999 | 0 |
| 0.8319444444444444 | 0 |
| 0.8326388888888889 | 0 |
| 0.8333333333333334 | 0 |
| 0.8340277777777777 | 0 |
| 0.8347222222222223 | 0 |
| 0.8354166666666667 | 0 |
| 0.8361111111111111 | 0 |
| 0.8368055555555555 | 0 |
| 0.8375 | 0 |
| 0.8381944444444445 | 0 |
| 0.8388888888888889 | 0 |
| 0.8395833333333332 | 0 |
| 0.8402777777777778 | 0 |
| 0.8409722222222222 | 0 |
| 0.8416666666666667 | 0 |
| 0.842361111111111 | 0 |
| 0.8430555555555556 | 0 |
| 0.84375 | 0 |
| 0.8444444444444444 | 0 |
| 0.845138888888889 | 0 |
| 0.8458333333333333 | 0 |
| 0.8465277777777778 | 0 |
| 0.8472222222222222 | 0 |
| 0.8479166666666668 | 0 |
| 0.8486111111111111 | 0 |
| 0.8493055555555555 | 0 |
| 0.85 | 0 |
| 0.8506944444444445 | 0 |
| 0.8513888888888889 | 0 |
| 0.8520833333333333 | 0 |
| 0.8527777777777777 | 0 |
| 0.8534722222222223 | 0 |
| 0.8541666666666666 | 0 |
| 0.8548611111111111 | 0 |
| 0.8555555555555556 | 0 |
| 0.8562500000000001 | 0 |
| 0.8569444444444444 | 0 |
| 0.8576388888888888 | 0 |
| 0.8583333333333334 | 0 |
| 0.8590277777777778 | 0 |
| 0.8597222222222222 | 0 |
| 0.8604166666666666 | 0 |
| 0.8611111111111112 | 0 |
| 0.8618055555555556 | 0 |
| 0.8624999999999999 | 0 |
| 0.8631944444444444 | 0 |
| 0.8638888888888889 | 0 |
| 0.8645833333333334 | 0 |
| 0.8652777777777777 | 0 |
| 0.8659722222222223 | 0 |
| 0.8666666666666667 | 0 |
| 0.8673611111111111 | 0 |
| 0.8680555555555555 | 0 |
| 0.86875 | 0 |
| 0.8694444444444445 | 0 |
| 0.8701388888888889 | 0 |
| 0.8708333333333332 | 0 |
| 0.8715277777777778 | 0 |
| 0.8722222222222222 | 0 |
| 0.8729166666666667 | 0 |
| 0.873611111111111 | 0 |
| 0.8743055555555556 | 0 |
| 0.875 | 0 |
| 0.8756944444444444 | 0 |
| 0.876388888888889 | 0 |
| 0.8770833333333333 | 0 |
| 0.8777777777777778 | 0 |
| 0.8784722222222222 | 0 |
| 0.8791666666666668 | 0 |
| 0.8798611111111111 | 0 |
| 0.8805555555555555 | 0 |
| 0.88125 | 0 |
| 0.8819444444444445 | 0 |
| 0.8826388888888889 | 0 |
| 0.8833333333333333 | 0 |
| 0.8840277777777777 | 0 |
| 0.8847222222222223 | 0 |
| 0.8854166666666666 | 0 |
| 0.8861111111111111 | 0 |
| 0.8868055555555556 | 0 |
| 0.8875000000000001 | 0 |
| 0.8881944444444444 | 0 |
| 0.8888888888888888 | 0 |
| 0.8895833333333334 | 0 |
| 0.8902777777777778 | 0 |
| 0.8909722222222222 | 0 |
| 0.8916666666666666 | 0 |
| 0.8923611111111112 | 0 |
| 0.8930555555555556 | 0 |
| 0.8937499999999999 | 0 |
| 0.8944444444444444 | 0 |
| 0.8951388888888889 | 0 |
| 0.8958333333333334 | 0 |
| 0.8965277777777777 | 0 |
| 0.8972222222222223 | 0 |
| 0.8979166666666667 | 0 |
| 0.8986111111111111 | 0 |
| 0.8993055555555555 | 0 |
| 0.9 | 0 |
| 0.9006944444444445 | 0 |
| 0.9013888888888889 | 0 |
| 0.9020833333333332 | 0 |
| 0.9027777777777778 | 0 |
| 0.9034722222222222 | 0 |
| 0.9041666666666667 | 0 |
| 0.904861111111111 | 0 |
| 0.9055555555555556 | 0 |
| 0.90625 | 0 |
| 0.9069444444444444 | 0 |
| 0.907638888888889 | 0 |
| 0.9083333333333333 | 0 |
| 0.9090277777777778 | 0 |
| 0.9097222222222222 | 0 |
| 0.9104166666666668 | 0 |
| 0.9111111111111111 | 0 |
| 0.9118055555555555 | 0 |
| 0.9125 | 0 |
| 0.9131944444444445 | 0 |
| 0.9138888888888889 | 0 |
| 0.9145833333333333 | 0 |
| 0.9152777777777777 | 0 |
| 0.9159722222222223 | 0 |
| 0.9166666666666666 | 0 |
| 0.9173611111111111 | 0 |
| 0.9180555555555556 | 0 |
| 0.9187500000000001 | 0 |
| 0.9194444444444444 | 0 |
| 0.9201388888888888 | 0 |
| 0.9208333333333334 | 0 |
| 0.9215277777777778 | 0 |
| 0.9222222222222222 | 0 |
| 0.9229166666666666 | 0 |
| 0.9236111111111112 | 0 |
| 0.9243055555555556 | 0 |
| 0.9249999999999999 | 0 |
| 0.9256944444444444 | 0 |
| 0.9263888888888889 | 0 |
| 0.9270833333333334 | 0 |
| 0.9277777777777777 | 0 |
| 0.9284722222222223 | 0 |
| 0.9291666666666667 | 0 |
| 0.9298611111111111 | 0 |
| 0.9305555555555555 | 0 |
| 0.93125 | 0 |
| 0.9319444444444445 | 0 |
| 0.9326388888888889 | 0 |
| 0.9333333333333332 | 0 |
| 0.9340277777777778 | 0 |
| 0.9347222222222222 | 0 |
| 0.9354166666666667 | 0 |
| 0.936111111111111 | 0 |
| 0.9368055555555556 | 0 |
| 0.9375 | 0 |
| 0.9381944444444444 | 0 |
| 0.938888888888889 | 0 |
| 0.9395833333333333 | 0 |
| 0.9402777777777778 | 0 |
| 0.9409722222222222 | 0 |
| 0.9416666666666668 | 0 |
| 0.9423611111111111 | 0 |
| 0.9430555555555555 | 0 |
| 0.94375 | 0 |
| 0.9444444444444445 | 0 |
| 0.9451388888888889 | 0 |
| 0.9458333333333333 | 0 |
| 0.9465277777777777 | 0 |
| 0.9472222222222223 | 0 |
| 0.9479166666666666 | 0 |
| 0.9486111111111111 | 0 |
| 0.9493055555555556 | 0 |
| 0.9500000000000001 | 0 |
| 0.9506944444444444 | 0 |
| 0.9513888888888888 | 0 |
| 0.9520833333333334 | 0 |
| 0.9527777777777778 | 0 |
| 0.9534722222222222 | 0 |
| 0.9541666666666666 | 0 |
| 0.9548611111111112 | 0 |
| 0.9555555555555556 | 0 |
| 0.9562499999999999 | 0 |
| 0.9569444444444444 | 0 |
| 0.9576388888888889 | 0 |
| 0.9583333333333334 | 0 |
| 0.9590277777777777 | 0 |
| 0.9597222222222223 | 0 |
| 0.9604166666666667 | 0 |
| 0.9611111111111111 | 0 |
| 0.9618055555555555 | 0 |
| 0.9625 | 0 |
| 0.9631944444444445 | 0 |
| 0.9638888888888889 | 0 |
| 0.9645833333333332 | 0 |
| 0.9652777777777778 | 0 |
| 0.9659722222222222 | 0 |
| 0.9666666666666667 | 0 |
| 0.967361111111111 | 0 |
| 0.9680555555555556 | 0 |
| 0.96875 | 0 |
| 0.9694444444444444 | 0 |
| 0.970138888888889 | 0 |
| 0.9708333333333333 | 0 |
| 0.9715277777777778 | 0 |
| 0.9722222222222222 | 0 |
| 0.9729166666666668 | 0 |
| 0.9736111111111111 | 0 |
| 0.9743055555555555 | 0 |
| 0.975 | 0 |
| 0.9756944444444445 | 0 |
| 0.9763888888888889 | 0 |
| 0.9770833333333333 | 0 |
| 0.9777777777777777 | 0 |
| 0.9784722222222223 | 0 |
| 0.9791666666666666 | 0 |
| 0.9798611111111111 | 0 |
| 0.9805555555555556 | 0 |
| 0.9812500000000001 | 0 |
| 0.9819444444444444 | 0 |
| 0.9826388888888888 | 0 |
| 0.9833333333333334 | 0 |
| 0.9840277777777778 | 0 |
| 0.9847222222222222 | 0 |
| 0.9854166666666666 | 0 |
| 0.9861111111111112 | 0 |
| 0.9868055555555556 | 0 |
| 0.9874999999999999 | 0 |
| 0.9881944444444444 | 0 |
| 0.9888888888888889 | 0 |
| 0.9895833333333334 | 0 |
| 0.9902777777777777 | 0 |
| 0.9909722222222223 | 0 |
| 0.9916666666666667 | 0 |
| 0.9923611111111111 | 0 |
| 0.9930555555555555 | 0 |
| 0.99375 | 0 |
| 0.9944444444444445 | 0 |
| 0.9951388888888889 | 0 |
| 0.9958333333333332 | 0 |
| 0.9965277777777778 | 0 |
| 0.9972222222222222 | 0 |
| 0.9979166666666667 | 0 |
| 0.998611111111111 | 0 |
| 0.9993055555555556 | 0 |